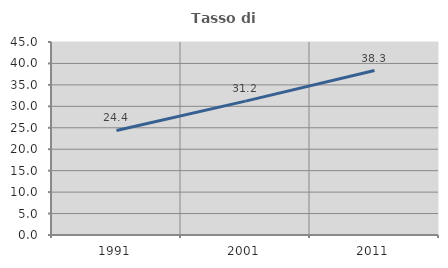
| Category | Tasso di occupazione   |
|---|---|
| 1991.0 | 24.384 |
| 2001.0 | 31.213 |
| 2011.0 | 38.34 |